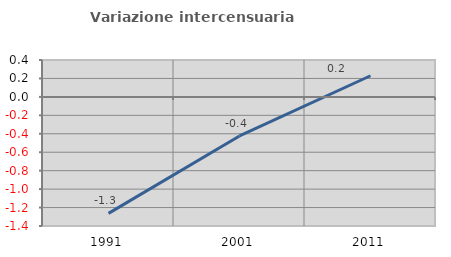
| Category | Variazione intercensuaria annua |
|---|---|
| 1991.0 | -1.263 |
| 2001.0 | -0.424 |
| 2011.0 | 0.229 |